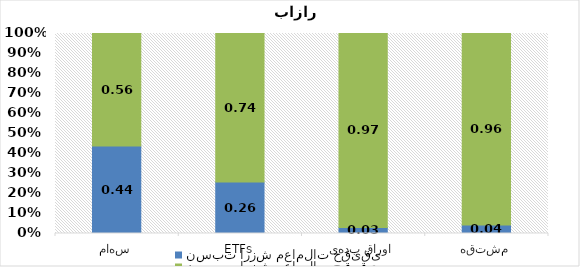
| Category | نسبت ارزش معاملات حقیقی | نسبت ارزش معاملات حقوقی |
|---|---|---|
| سهام | 0.437 | 0.563 |
| ETFs | 0.258 | 0.742 |
| اوراق بدهی | 0.03 | 0.97 |
| مشتقه | 0.042 | 0.958 |